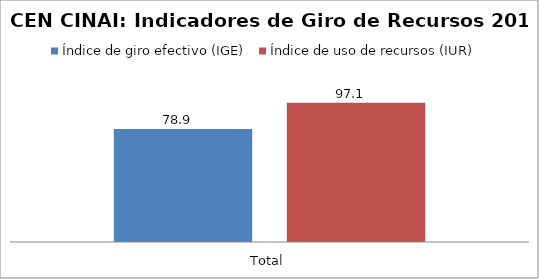
| Category | Índice de giro efectivo (IGE) | Índice de uso de recursos (IUR)  |
|---|---|---|
| Total | 78.916 | 97.087 |